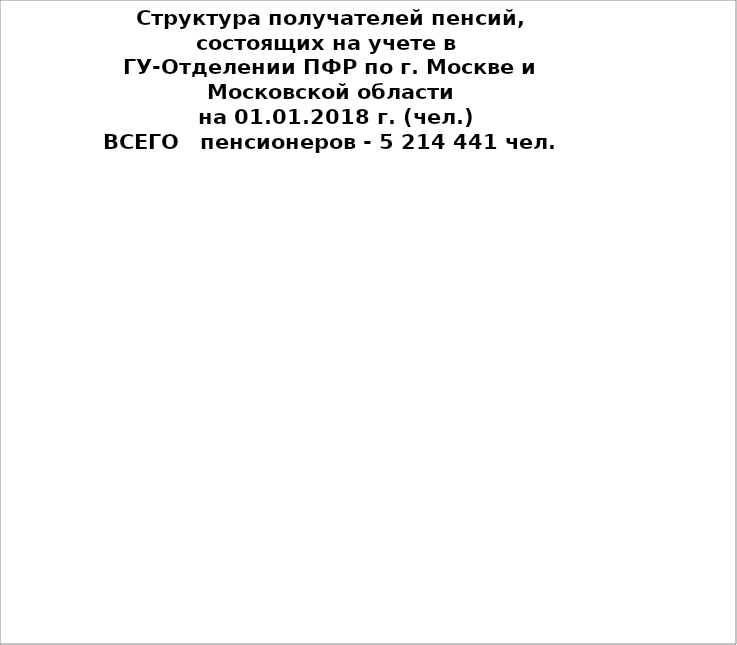
| Category | Series 0 |
|---|---|
| Страховые пенсии | 0 |
| Государственное пенсионное обеспечение | 0 |
| Страховые пенсии по старости | 0 |
| Страховые пенсии по инвалидности | 0 |
| Страховые пенсии по СПК | 0 |